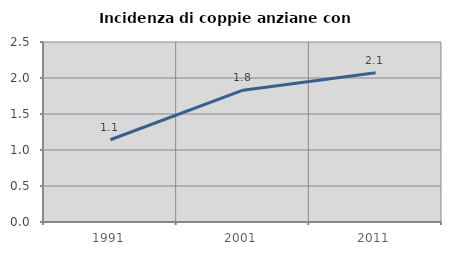
| Category | Incidenza di coppie anziane con figli |
|---|---|
| 1991.0 | 1.142 |
| 2001.0 | 1.831 |
| 2011.0 | 2.072 |